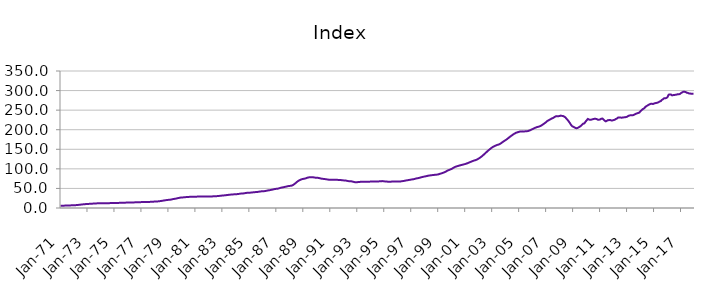
| Category | Index |
|---|---|
| 1971-01-01 | 5.879 |
| 1971-02-01 | 5.921 |
| 1971-03-01 | 5.963 |
| 1971-04-01 | 6.018 |
| 1971-05-01 | 6.108 |
| 1971-06-01 | 6.203 |
| 1971-07-01 | 6.32 |
| 1971-08-01 | 6.446 |
| 1971-09-01 | 6.572 |
| 1971-10-01 | 6.703 |
| 1971-11-01 | 6.844 |
| 1971-12-01 | 7.015 |
| 1972-01-01 | 7.135 |
| 1972-02-01 | 7.213 |
| 1972-03-01 | 7.39 |
| 1972-04-01 | 7.638 |
| 1972-05-01 | 7.997 |
| 1972-06-01 | 8.312 |
| 1972-07-01 | 8.674 |
| 1972-08-01 | 9.023 |
| 1972-09-01 | 9.332 |
| 1972-10-01 | 9.62 |
| 1972-11-01 | 9.887 |
| 1972-12-01 | 10.162 |
| 1973-01-01 | 10.359 |
| 1973-02-01 | 10.498 |
| 1973-03-01 | 10.658 |
| 1973-04-01 | 10.841 |
| 1973-05-01 | 11.075 |
| 1973-06-01 | 11.227 |
| 1973-07-01 | 11.386 |
| 1973-08-01 | 11.562 |
| 1973-09-01 | 11.768 |
| 1973-10-01 | 11.982 |
| 1973-11-01 | 12.145 |
| 1973-12-01 | 12.262 |
| 1974-01-01 | 12.324 |
| 1974-02-01 | 12.392 |
| 1974-03-01 | 12.389 |
| 1974-04-01 | 12.362 |
| 1974-05-01 | 12.339 |
| 1974-06-01 | 12.34 |
| 1974-07-01 | 12.352 |
| 1974-08-01 | 12.392 |
| 1974-09-01 | 12.465 |
| 1974-10-01 | 12.555 |
| 1974-11-01 | 12.63 |
| 1974-12-01 | 12.703 |
| 1975-01-01 | 12.737 |
| 1975-02-01 | 12.78 |
| 1975-03-01 | 12.857 |
| 1975-04-01 | 12.965 |
| 1975-05-01 | 13.097 |
| 1975-06-01 | 13.168 |
| 1975-07-01 | 13.237 |
| 1975-08-01 | 13.332 |
| 1975-09-01 | 13.462 |
| 1975-10-01 | 13.606 |
| 1975-11-01 | 13.732 |
| 1975-12-01 | 13.867 |
| 1976-01-01 | 13.963 |
| 1976-02-01 | 14.052 |
| 1976-03-01 | 14.114 |
| 1976-04-01 | 14.179 |
| 1976-05-01 | 14.264 |
| 1976-06-01 | 14.32 |
| 1976-07-01 | 14.382 |
| 1976-08-01 | 14.474 |
| 1976-09-01 | 14.605 |
| 1976-10-01 | 14.752 |
| 1976-11-01 | 14.87 |
| 1976-12-01 | 14.976 |
| 1977-01-01 | 15.034 |
| 1977-02-01 | 15.102 |
| 1977-03-01 | 15.145 |
| 1977-04-01 | 15.197 |
| 1977-05-01 | 15.276 |
| 1977-06-01 | 15.347 |
| 1977-07-01 | 15.436 |
| 1977-08-01 | 15.557 |
| 1977-09-01 | 15.705 |
| 1977-10-01 | 15.871 |
| 1977-11-01 | 16.048 |
| 1977-12-01 | 16.278 |
| 1978-01-01 | 16.449 |
| 1978-02-01 | 16.582 |
| 1978-03-01 | 16.762 |
| 1978-04-01 | 17.003 |
| 1978-05-01 | 17.391 |
| 1978-06-01 | 17.783 |
| 1978-07-01 | 18.258 |
| 1978-08-01 | 18.744 |
| 1978-09-01 | 19.213 |
| 1978-10-01 | 19.678 |
| 1978-11-01 | 20.113 |
| 1978-12-01 | 20.542 |
| 1979-01-01 | 20.797 |
| 1979-02-01 | 20.968 |
| 1979-03-01 | 21.394 |
| 1979-04-01 | 21.979 |
| 1979-05-01 | 22.725 |
| 1979-06-01 | 23.198 |
| 1979-07-01 | 23.69 |
| 1979-08-01 | 24.243 |
| 1979-09-01 | 24.906 |
| 1979-10-01 | 25.613 |
| 1979-11-01 | 26.202 |
| 1979-12-01 | 26.66 |
| 1980-01-01 | 26.911 |
| 1980-02-01 | 27.107 |
| 1980-03-01 | 27.357 |
| 1980-04-01 | 27.651 |
| 1980-05-01 | 27.994 |
| 1980-06-01 | 28.178 |
| 1980-07-01 | 28.344 |
| 1980-08-01 | 28.498 |
| 1980-09-01 | 28.607 |
| 1980-10-01 | 28.676 |
| 1980-11-01 | 28.73 |
| 1980-12-01 | 28.843 |
| 1981-01-01 | 28.911 |
| 1981-02-01 | 29.013 |
| 1981-03-01 | 29.116 |
| 1981-04-01 | 29.254 |
| 1981-05-01 | 29.394 |
| 1981-06-01 | 29.441 |
| 1981-07-01 | 29.464 |
| 1981-08-01 | 29.469 |
| 1981-09-01 | 29.414 |
| 1981-10-01 | 29.312 |
| 1981-11-01 | 29.219 |
| 1981-12-01 | 29.209 |
| 1982-01-01 | 29.164 |
| 1982-02-01 | 29.184 |
| 1982-03-01 | 29.346 |
| 1982-04-01 | 29.618 |
| 1982-05-01 | 29.924 |
| 1982-06-01 | 30.035 |
| 1982-07-01 | 30.119 |
| 1982-08-01 | 30.28 |
| 1982-09-01 | 30.54 |
| 1982-10-01 | 30.849 |
| 1982-11-01 | 31.157 |
| 1982-12-01 | 31.538 |
| 1983-01-01 | 31.828 |
| 1983-02-01 | 32.078 |
| 1983-03-01 | 32.337 |
| 1983-04-01 | 32.659 |
| 1983-05-01 | 33.081 |
| 1983-06-01 | 33.413 |
| 1983-07-01 | 33.773 |
| 1983-08-01 | 34.116 |
| 1983-09-01 | 34.39 |
| 1983-10-01 | 34.614 |
| 1983-11-01 | 34.826 |
| 1983-12-01 | 35.104 |
| 1984-01-01 | 35.27 |
| 1984-02-01 | 35.438 |
| 1984-03-01 | 35.758 |
| 1984-04-01 | 36.202 |
| 1984-05-01 | 36.71 |
| 1984-06-01 | 36.936 |
| 1984-07-01 | 37.124 |
| 1984-08-01 | 37.411 |
| 1984-09-01 | 37.87 |
| 1984-10-01 | 38.4 |
| 1984-11-01 | 38.81 |
| 1984-12-01 | 39.095 |
| 1985-01-01 | 39.174 |
| 1985-02-01 | 39.283 |
| 1985-03-01 | 39.552 |
| 1985-04-01 | 39.93 |
| 1985-05-01 | 40.361 |
| 1985-06-01 | 40.527 |
| 1985-07-01 | 40.681 |
| 1985-08-01 | 40.948 |
| 1985-09-01 | 41.393 |
| 1985-10-01 | 41.902 |
| 1985-11-01 | 42.329 |
| 1985-12-01 | 42.671 |
| 1986-01-01 | 42.803 |
| 1986-02-01 | 42.939 |
| 1986-03-01 | 43.335 |
| 1986-04-01 | 43.908 |
| 1986-05-01 | 44.624 |
| 1986-06-01 | 45.057 |
| 1986-07-01 | 45.499 |
| 1986-08-01 | 46.028 |
| 1986-09-01 | 46.692 |
| 1986-10-01 | 47.409 |
| 1986-11-01 | 48.06 |
| 1986-12-01 | 48.667 |
| 1987-01-01 | 49.02 |
| 1987-02-01 | 49.311 |
| 1987-03-01 | 49.944 |
| 1987-04-01 | 50.795 |
| 1987-05-01 | 51.813 |
| 1987-06-01 | 52.387 |
| 1987-07-01 | 52.937 |
| 1987-08-01 | 53.541 |
| 1987-09-01 | 54.197 |
| 1987-10-01 | 54.877 |
| 1987-11-01 | 55.513 |
| 1987-12-01 | 56.172 |
| 1988-01-01 | 56.486 |
| 1988-02-01 | 56.756 |
| 1988-03-01 | 57.701 |
| 1988-04-01 | 59.124 |
| 1988-05-01 | 61.264 |
| 1988-06-01 | 63.424 |
| 1988-07-01 | 65.968 |
| 1988-08-01 | 68.307 |
| 1988-09-01 | 70.109 |
| 1988-10-01 | 71.604 |
| 1988-11-01 | 72.807 |
| 1988-12-01 | 73.875 |
| 1989-01-01 | 74.434 |
| 1989-02-01 | 74.906 |
| 1989-03-01 | 75.707 |
| 1989-04-01 | 76.727 |
| 1989-05-01 | 77.807 |
| 1989-06-01 | 78.279 |
| 1989-07-01 | 78.601 |
| 1989-08-01 | 78.752 |
| 1989-09-01 | 78.622 |
| 1989-10-01 | 78.258 |
| 1989-11-01 | 77.774 |
| 1989-12-01 | 77.38 |
| 1990-01-01 | 77.025 |
| 1990-02-01 | 77.011 |
| 1990-03-01 | 76.482 |
| 1990-04-01 | 75.796 |
| 1990-05-01 | 74.994 |
| 1990-06-01 | 74.611 |
| 1990-07-01 | 74.285 |
| 1990-08-01 | 73.967 |
| 1990-09-01 | 73.52 |
| 1990-10-01 | 73.009 |
| 1990-11-01 | 72.535 |
| 1990-12-01 | 72.334 |
| 1991-01-01 | 72.192 |
| 1991-02-01 | 72.268 |
| 1991-03-01 | 72.153 |
| 1991-04-01 | 72.077 |
| 1991-05-01 | 71.977 |
| 1991-06-01 | 71.933 |
| 1991-07-01 | 71.885 |
| 1991-08-01 | 71.819 |
| 1991-09-01 | 71.705 |
| 1991-10-01 | 71.501 |
| 1991-11-01 | 71.166 |
| 1991-12-01 | 70.813 |
| 1992-01-01 | 70.463 |
| 1992-02-01 | 70.409 |
| 1992-03-01 | 69.918 |
| 1992-04-01 | 69.325 |
| 1992-05-01 | 68.671 |
| 1992-06-01 | 68.457 |
| 1992-07-01 | 68.303 |
| 1992-08-01 | 67.98 |
| 1992-09-01 | 67.29 |
| 1992-10-01 | 66.434 |
| 1992-11-01 | 65.854 |
| 1992-12-01 | 65.871 |
| 1993-01-01 | 66.034 |
| 1993-02-01 | 66.322 |
| 1993-03-01 | 66.581 |
| 1993-04-01 | 66.905 |
| 1993-05-01 | 67.182 |
| 1993-06-01 | 67.213 |
| 1993-07-01 | 67.233 |
| 1993-08-01 | 67.289 |
| 1993-09-01 | 67.247 |
| 1993-10-01 | 67.126 |
| 1993-11-01 | 67.046 |
| 1993-12-01 | 67.281 |
| 1994-01-01 | 67.604 |
| 1994-02-01 | 68.006 |
| 1994-03-01 | 67.991 |
| 1994-04-01 | 67.827 |
| 1994-05-01 | 67.683 |
| 1994-06-01 | 67.696 |
| 1994-07-01 | 67.777 |
| 1994-08-01 | 67.944 |
| 1994-09-01 | 68.21 |
| 1994-10-01 | 68.532 |
| 1994-11-01 | 68.685 |
| 1994-12-01 | 68.595 |
| 1995-01-01 | 68.092 |
| 1995-02-01 | 67.66 |
| 1995-03-01 | 67.497 |
| 1995-04-01 | 67.327 |
| 1995-05-01 | 67.356 |
| 1995-06-01 | 67.213 |
| 1995-07-01 | 67.36 |
| 1995-08-01 | 67.425 |
| 1995-09-01 | 67.463 |
| 1995-10-01 | 67.439 |
| 1995-11-01 | 67.524 |
| 1995-12-01 | 67.607 |
| 1996-01-01 | 67.632 |
| 1996-02-01 | 67.59 |
| 1996-03-01 | 67.814 |
| 1996-04-01 | 68.077 |
| 1996-05-01 | 68.578 |
| 1996-06-01 | 68.945 |
| 1996-07-01 | 69.543 |
| 1996-08-01 | 70.122 |
| 1996-09-01 | 70.708 |
| 1996-10-01 | 71.134 |
| 1996-11-01 | 71.585 |
| 1996-12-01 | 72.224 |
| 1997-01-01 | 72.682 |
| 1997-02-01 | 73.17 |
| 1997-03-01 | 73.587 |
| 1997-04-01 | 74.264 |
| 1997-05-01 | 75.148 |
| 1997-06-01 | 75.819 |
| 1997-07-01 | 76.292 |
| 1997-08-01 | 77.048 |
| 1997-09-01 | 77.723 |
| 1997-10-01 | 78.598 |
| 1997-11-01 | 79.21 |
| 1997-12-01 | 79.988 |
| 1998-01-01 | 80.449 |
| 1998-02-01 | 81.141 |
| 1998-03-01 | 81.745 |
| 1998-04-01 | 82.495 |
| 1998-05-01 | 83.027 |
| 1998-06-01 | 83.355 |
| 1998-07-01 | 83.747 |
| 1998-08-01 | 84.113 |
| 1998-09-01 | 84.484 |
| 1998-10-01 | 84.731 |
| 1998-11-01 | 85.018 |
| 1998-12-01 | 85.363 |
| 1999-01-01 | 85.875 |
| 1999-02-01 | 86.896 |
| 1999-03-01 | 87.796 |
| 1999-04-01 | 88.688 |
| 1999-05-01 | 89.666 |
| 1999-06-01 | 90.701 |
| 1999-07-01 | 91.918 |
| 1999-08-01 | 93.495 |
| 1999-09-01 | 95.101 |
| 1999-10-01 | 96.577 |
| 1999-11-01 | 97.58 |
| 1999-12-01 | 98.926 |
| 2000-01-01 | 100 |
| 2000-02-01 | 101.936 |
| 2000-03-01 | 103.455 |
| 2000-04-01 | 105.075 |
| 2000-05-01 | 105.895 |
| 2000-06-01 | 106.901 |
| 2000-07-01 | 107.798 |
| 2000-08-01 | 108.633 |
| 2000-09-01 | 109.409 |
| 2000-10-01 | 110.207 |
| 2000-11-01 | 110.863 |
| 2000-12-01 | 111.699 |
| 2001-01-01 | 112.376 |
| 2001-02-01 | 113.427 |
| 2001-03-01 | 114.41 |
| 2001-04-01 | 115.617 |
| 2001-05-01 | 116.92 |
| 2001-06-01 | 118 |
| 2001-07-01 | 119.178 |
| 2001-08-01 | 120.352 |
| 2001-09-01 | 121.415 |
| 2001-10-01 | 122.129 |
| 2001-11-01 | 123.346 |
| 2001-12-01 | 124.695 |
| 2002-01-01 | 126.498 |
| 2002-02-01 | 128.249 |
| 2002-03-01 | 130.341 |
| 2002-04-01 | 132.594 |
| 2002-05-01 | 135.137 |
| 2002-06-01 | 137.714 |
| 2002-07-01 | 140.534 |
| 2002-08-01 | 143.04 |
| 2002-09-01 | 145.7 |
| 2002-10-01 | 148.191 |
| 2002-11-01 | 150.379 |
| 2002-12-01 | 152.788 |
| 2003-01-01 | 154.938 |
| 2003-02-01 | 156.702 |
| 2003-03-01 | 158.127 |
| 2003-04-01 | 159.492 |
| 2003-05-01 | 160.649 |
| 2003-06-01 | 161.58 |
| 2003-07-01 | 162.401 |
| 2003-08-01 | 164.014 |
| 2003-09-01 | 165.699 |
| 2003-10-01 | 167.901 |
| 2003-11-01 | 170.039 |
| 2003-12-01 | 171.829 |
| 2004-01-01 | 173.609 |
| 2004-02-01 | 175.589 |
| 2004-03-01 | 177.991 |
| 2004-04-01 | 180.138 |
| 2004-05-01 | 182.465 |
| 2004-06-01 | 184.54 |
| 2004-07-01 | 186.551 |
| 2004-08-01 | 188.625 |
| 2004-09-01 | 190.257 |
| 2004-10-01 | 192.019 |
| 2004-11-01 | 192.962 |
| 2004-12-01 | 193.904 |
| 2005-01-01 | 194.627 |
| 2005-02-01 | 195.72 |
| 2005-03-01 | 195.655 |
| 2005-04-01 | 195.754 |
| 2005-05-01 | 195.194 |
| 2005-06-01 | 195.793 |
| 2005-07-01 | 195.867 |
| 2005-08-01 | 196.175 |
| 2005-09-01 | 196.736 |
| 2005-10-01 | 197.938 |
| 2005-11-01 | 198.884 |
| 2005-12-01 | 200.645 |
| 2006-01-01 | 201.661 |
| 2006-02-01 | 203.374 |
| 2006-03-01 | 204.511 |
| 2006-04-01 | 205.861 |
| 2006-05-01 | 206.826 |
| 2006-06-01 | 207.511 |
| 2006-07-01 | 208.388 |
| 2006-08-01 | 209.567 |
| 2006-09-01 | 211.353 |
| 2006-10-01 | 213.443 |
| 2006-11-01 | 215.14 |
| 2006-12-01 | 217.475 |
| 2007-01-01 | 219.496 |
| 2007-02-01 | 222.231 |
| 2007-03-01 | 223.7 |
| 2007-04-01 | 225.58 |
| 2007-05-01 | 226.869 |
| 2007-06-01 | 228.812 |
| 2007-07-01 | 229.701 |
| 2007-08-01 | 231.63 |
| 2007-09-01 | 233.384 |
| 2007-10-01 | 234.664 |
| 2007-11-01 | 234.312 |
| 2007-12-01 | 234.555 |
| 2008-01-01 | 235.086 |
| 2008-02-01 | 236.026 |
| 2008-03-01 | 235.364 |
| 2008-04-01 | 234.965 |
| 2008-05-01 | 233.6 |
| 2008-06-01 | 231.702 |
| 2008-07-01 | 228.29 |
| 2008-08-01 | 225.152 |
| 2008-09-01 | 221.485 |
| 2008-10-01 | 217.485 |
| 2008-11-01 | 212.758 |
| 2008-12-01 | 209.323 |
| 2009-01-01 | 207.652 |
| 2009-02-01 | 206.212 |
| 2009-03-01 | 204.576 |
| 2009-04-01 | 203.86 |
| 2009-05-01 | 204.572 |
| 2009-06-01 | 206.247 |
| 2009-07-01 | 207.906 |
| 2009-08-01 | 210.209 |
| 2009-09-01 | 213.072 |
| 2009-10-01 | 215.548 |
| 2009-11-01 | 216.169 |
| 2009-12-01 | 220.435 |
| 2010-01-01 | 223.882 |
| 2010-02-01 | 227.544 |
| 2010-03-01 | 226.207 |
| 2010-04-01 | 225.371 |
| 2010-05-01 | 225.616 |
| 2010-06-01 | 226.496 |
| 2010-07-01 | 227.242 |
| 2010-08-01 | 228.031 |
| 2010-09-01 | 227.934 |
| 2010-10-01 | 227.086 |
| 2010-11-01 | 225.565 |
| 2010-12-01 | 225.597 |
| 2011-01-01 | 226.214 |
| 2011-02-01 | 228.039 |
| 2011-03-01 | 228.503 |
| 2011-04-01 | 226.162 |
| 2011-05-01 | 223.102 |
| 2011-06-01 | 221.419 |
| 2011-07-01 | 222.781 |
| 2011-08-01 | 224.513 |
| 2011-09-01 | 224.472 |
| 2011-10-01 | 224.841 |
| 2011-11-01 | 223.579 |
| 2011-12-01 | 223.822 |
| 2012-01-01 | 224.584 |
| 2012-02-01 | 225.473 |
| 2012-03-01 | 227.466 |
| 2012-04-01 | 228.575 |
| 2012-05-01 | 231.11 |
| 2012-06-01 | 231.251 |
| 2012-07-01 | 231.282 |
| 2012-08-01 | 230.612 |
| 2012-09-01 | 231.126 |
| 2012-10-01 | 231.503 |
| 2012-11-01 | 231.747 |
| 2012-12-01 | 232.346 |
| 2013-01-01 | 233.26 |
| 2013-02-01 | 235.199 |
| 2013-03-01 | 236.287 |
| 2013-04-01 | 236.897 |
| 2013-05-01 | 236.822 |
| 2013-06-01 | 237.016 |
| 2013-07-01 | 237.888 |
| 2013-08-01 | 239.493 |
| 2013-09-01 | 240.786 |
| 2013-10-01 | 242.115 |
| 2013-11-01 | 242.898 |
| 2013-12-01 | 244.057 |
| 2014-01-01 | 247.816 |
| 2014-02-01 | 250.169 |
| 2014-03-01 | 252.769 |
| 2014-04-01 | 254.326 |
| 2014-05-01 | 257.246 |
| 2014-06-01 | 260.069 |
| 2014-07-01 | 261.53 |
| 2014-08-01 | 263.472 |
| 2014-09-01 | 264.905 |
| 2014-10-01 | 266.07 |
| 2014-11-01 | 266.347 |
| 2014-12-01 | 265.659 |
| 2015-01-01 | 266.928 |
| 2015-02-01 | 267.88 |
| 2015-03-01 | 268.307 |
| 2015-04-01 | 269.155 |
| 2015-05-01 | 270.34 |
| 2015-06-01 | 272.163 |
| 2015-07-01 | 273.277 |
| 2015-08-01 | 276.288 |
| 2015-09-01 | 278.116 |
| 2015-10-01 | 280.486 |
| 2015-11-01 | 280.294 |
| 2015-12-01 | 281.199 |
| 2016-01-01 | 283.607 |
| 2016-02-01 | 289.619 |
| 2016-03-01 | 290.057 |
| 2016-04-01 | 289.886 |
| 2016-05-01 | 287.681 |
| 2016-06-01 | 288.483 |
| 2016-07-01 | 288.661 |
| 2016-08-01 | 289.259 |
| 2016-09-01 | 289.711 |
| 2016-10-01 | 290.701 |
| 2016-11-01 | 290.463 |
| 2016-12-01 | 291.375 |
| 2017-01-01 | 293.708 |
| 2017-02-01 | 295.4 |
| 2017-03-01 | 296.978 |
| 2017-04-01 | 296.806 |
| 2017-05-01 | 296.421 |
| 2017-06-01 | 294.581 |
| 2017-07-01 | 293.98 |
| 2017-08-01 | 292.809 |
| 2017-09-01 | 292.653 |
| 2017-10-01 | 291.685 |
| 2017-11-01 | 291.824 |
| 2017-12-01 | 291.912 |